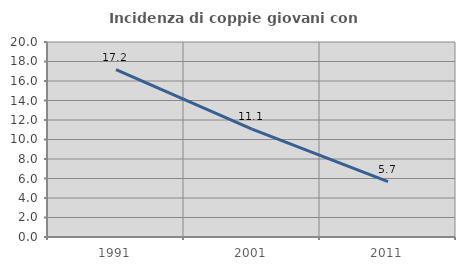
| Category | Incidenza di coppie giovani con figli |
|---|---|
| 1991.0 | 17.169 |
| 2001.0 | 11.072 |
| 2011.0 | 5.672 |